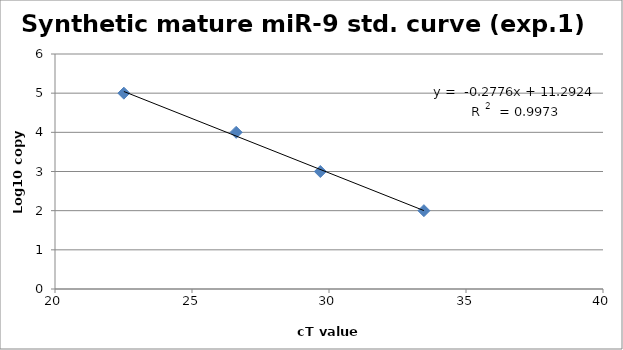
| Category | Series 0 |
|---|---|
| 33.463266372680664 | 2 |
| 29.683665593465168 | 3 |
| 26.612067540486652 | 4 |
| 22.513240814208984 | 5 |